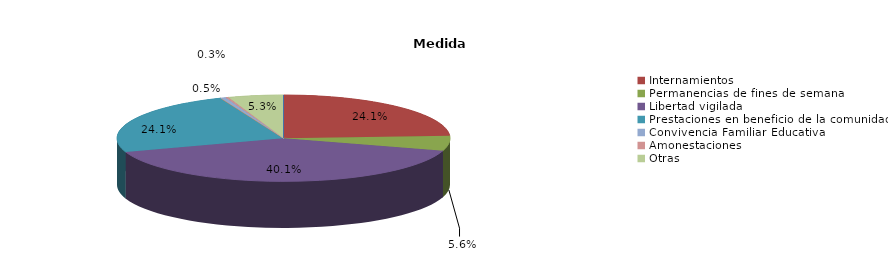
| Category | Series 0 |
|---|---|
| Expedientes de ejecución | 0 |
| Internamientos | 90 |
| Permanencias de fines de semana | 21 |
| Libertad vigilada | 150 |
| Prestaciones en beneficio de la comunidad | 90 |
| Privación de permisos y licencias | 0 |
| Convivencia Familiar Educativa | 2 |
| Amonestaciones | 1 |
| Otras | 20 |